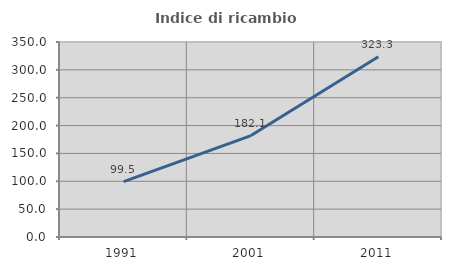
| Category | Indice di ricambio occupazionale  |
|---|---|
| 1991.0 | 99.542 |
| 2001.0 | 182.07 |
| 2011.0 | 323.348 |